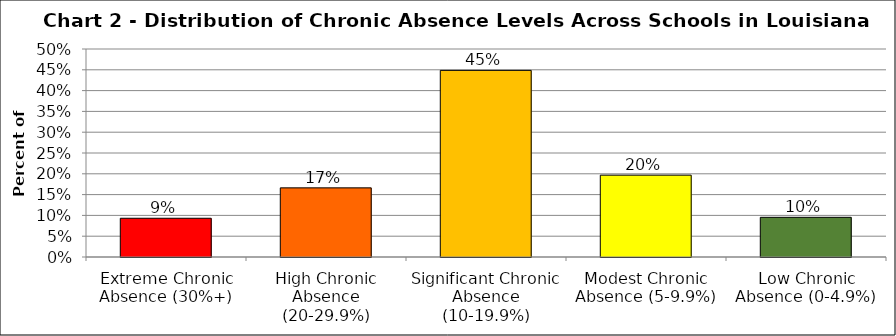
| Category | Series 1 |
|---|---|
| Extreme Chronic Absence (30%+) | 0.093 |
| High Chronic Absence (20-29.9%) | 0.166 |
| Significant Chronic Absence (10-19.9%) | 0.449 |
| Modest Chronic Absence (5-9.9%) | 0.197 |
| Low Chronic Absence (0-4.9%) | 0.095 |